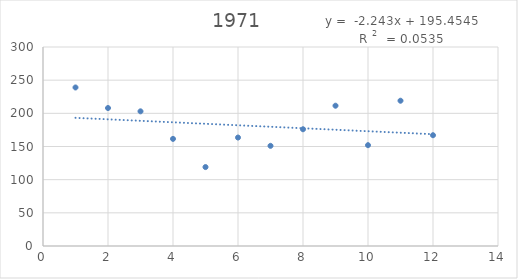
| Category | Series 0 |
|---|---|
| 1.0 | 239 |
| 2.0 | 208 |
| 3.0 | 203 |
| 4.0 | 161.5 |
| 5.0 | 119 |
| 6.0 | 163.5 |
| 7.0 | 151 |
| 8.0 | 176 |
| 9.0 | 211.5 |
| 10.0 | 152 |
| 11.0 | 219 |
| 12.0 | 167 |